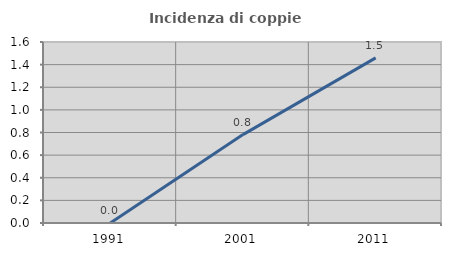
| Category | Incidenza di coppie miste |
|---|---|
| 1991.0 | 0 |
| 2001.0 | 0.781 |
| 2011.0 | 1.46 |